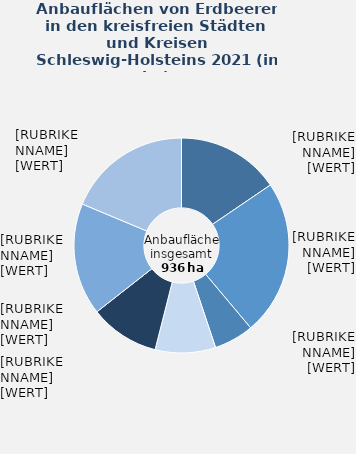
| Category | Erdbeeren |
|---|---|
| Herzogtum Lauenburg | 145 |
| Ostholstein | 219 |
| Plön | 56 |
| Schleswig-Flensburg | 85 |
| Segeberg | 98 |
| Stormarn | 158 |
| übrige kreisfreie Städte und Kreise | 175 |